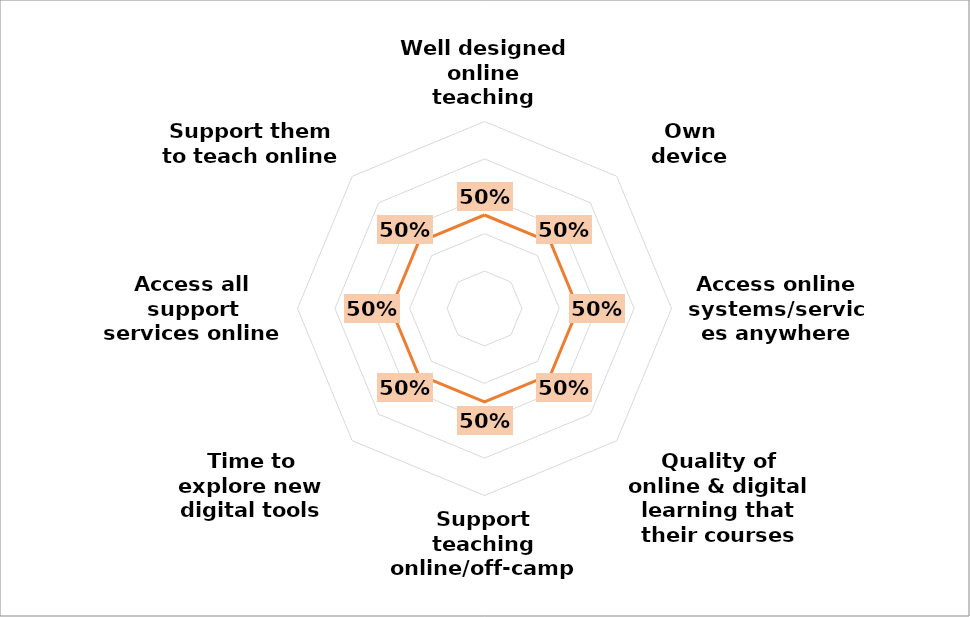
| Category | Percentage |
|---|---|
| Well designed online teaching environment | 0.5 |
| Own device support | 0.5 |
| Access online systems/services anywhere | 0.5 |
| Quality of online & digital learning that their courses provide | 0.5 |
| Support teaching online/off-campus | 0.5 |
| Time to explore new digital tools and approaches | 0.5 |
| Access all support services online | 0.5 |
| Support them to teach online | 0.5 |